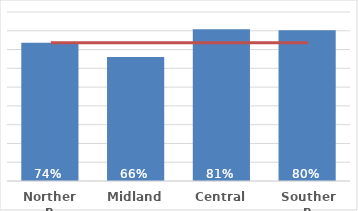
| Category | Māori |
|---|---|
| Northern | 0.737 |
| Midland | 0.66 |
| Central | 0.808 |
| Southern | 0.802 |